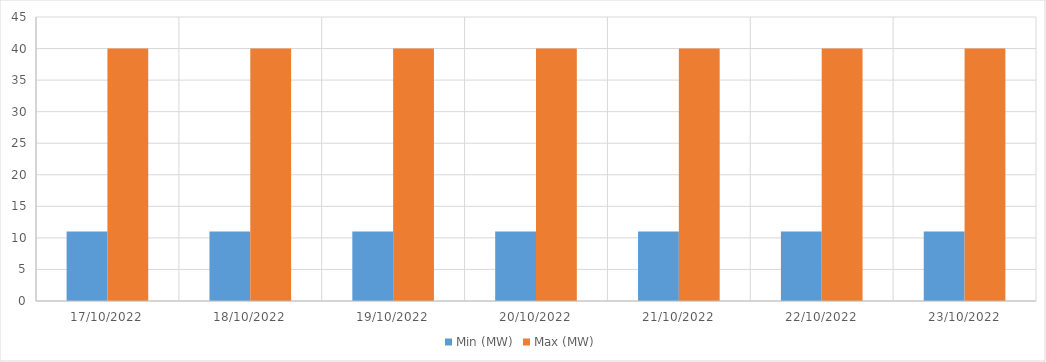
| Category | Min (MW) | Max (MW) |
|---|---|---|
| 17/10/2022 | 11 | 40 |
| 18/10/2022 | 11 | 40 |
| 19/10/2022 | 11 | 40 |
| 20/10/2022 | 11 | 40 |
| 21/10/2022 | 11 | 40 |
| 22/10/2022 | 11 | 40 |
| 23/10/2022 | 11 | 40 |